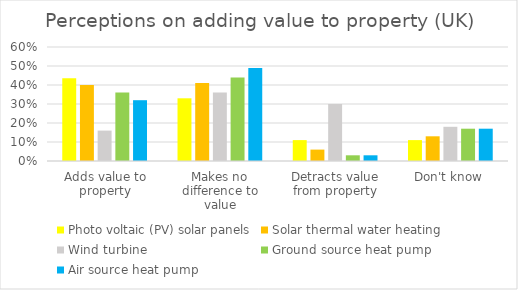
| Category | Photo voltaic (PV) solar panels | Solar thermal water heating | Wind turbine | Ground source heat pump | Air source heat pump |
|---|---|---|---|---|---|
| Adds value to property | 0.436 | 0.4 | 0.16 | 0.36 | 0.32 |
| Makes no difference to value | 0.33 | 0.41 | 0.36 | 0.44 | 0.49 |
| Detracts value from property | 0.11 | 0.06 | 0.3 | 0.03 | 0.03 |
| Don't know | 0.11 | 0.13 | 0.18 | 0.17 | 0.17 |